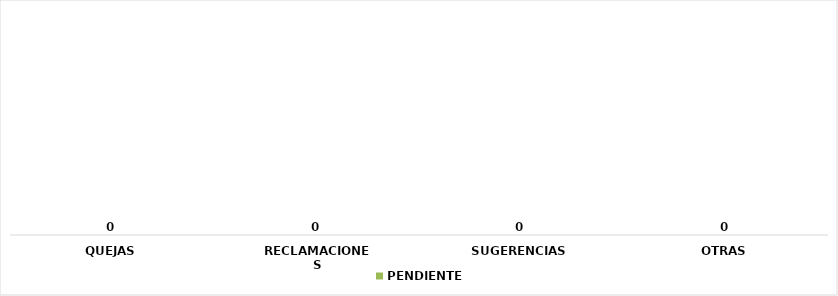
| Category | PENDIENTE |
|---|---|
| QUEJAS | 0 |
| RECLAMACIONES | 0 |
| SUGERENCIAS | 0 |
| OTRAS | 0 |